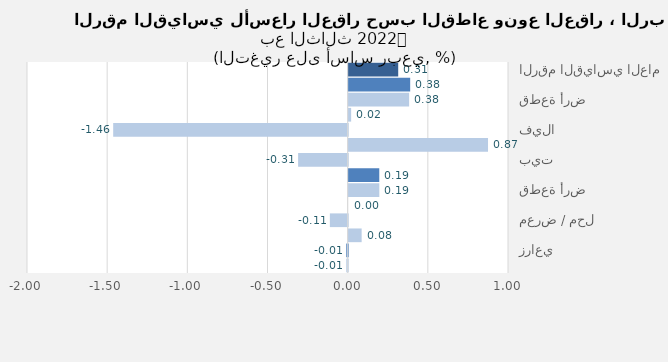
| Category | Series 0 |
|---|---|
| الرقم القياسي العام | 0.309 |
| سكني | 0.384 |
| قطعة أرض | 0.377 |
| عمارة | 0.015 |
| فيلا | -1.462 |
| شقة | 0.869 |
| بيت | -0.309 |
| تجاري | 0.191 |
| قطعة أرض | 0.191 |
| عمارة | 0 |
| معرض / محل | -0.111 |
| مركز تجاري | 0.081 |
| زراعي | -0.009 |
| ارض زراعية | -0.009 |